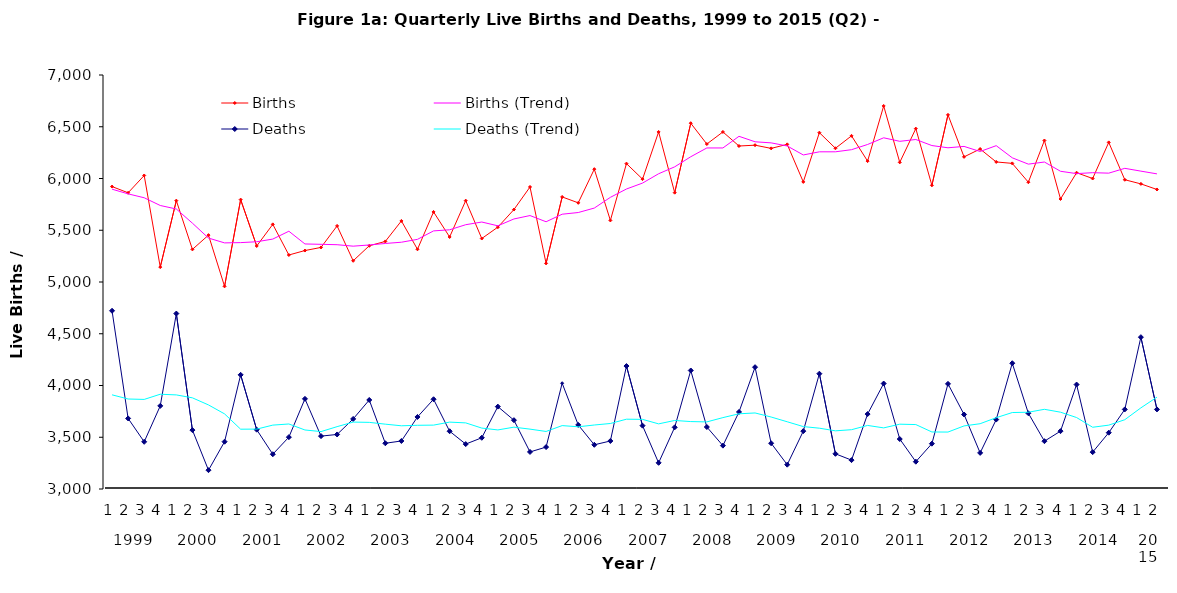
| Category | Births | Births (Trend) | Deaths | Deaths (Trend) |
|---|---|---|---|---|
| 0 | 5922 | 5896.75 | 4722 | 3910 |
| 1 | 5862 | 5851.5 | 3682 | 3869.5 |
| 2 | 6029 | 5814 | 3456 | 3865.5 |
| 3 | 5144 | 5739.25 | 3803 | 3915.75 |
| 4 | 5786 | 5705.25 | 4695 | 3909 |
| 5 | 5315 | 5568.5 | 3569 | 3880.75 |
| 6 | 5453 | 5424.5 | 3182 | 3812.25 |
| 7 | 4958 | 5378 | 3457 | 3725.75 |
| 8 | 5796 | 5380.5 | 4103 | 3577.75 |
| 9 | 5348 | 5388.75 | 3573 | 3578.75 |
| 10 | 5557 | 5414.75 | 3336 | 3617.25 |
| 11 | 5261 | 5490.5 | 3501 | 3628.25 |
| 12 | 5304 | 5367.5 | 3871 | 3570.25 |
| 13 | 5334 | 5364 | 3511 | 3554.75 |
| 14 | 5542 | 5360.25 | 3527 | 3602.5 |
| 15 | 5205 | 5346.25 | 3677 | 3646.5 |
| 16 | 5350 | 5357.75 | 3860 | 3643.75 |
| 17 | 5392 | 5372.25 | 3442 | 3626.5 |
| 18 | 5590 | 5384.25 | 3464 | 3610.75 |
| 19 | 5316 | 5412 | 3696 | 3615.5 |
| 20 | 5677 | 5493.75 | 3867 | 3617.25 |
| 21 | 5435 | 5504.5 | 3558 | 3646.25 |
| 22 | 5786 | 5553.5 | 3434 | 3638.75 |
| 23 | 5420 | 5579.5 | 3495 | 3588.5 |
| 24 | 5530 | 5542.75 | 3796 | 3570.75 |
| 25 | 5700 | 5609 | 3665 | 3597.5 |
| 26 | 5918 | 5642 | 3358 | 3578.5 |
| 27 | 5180 | 5582 | 3405 | 3556 |
| 28 | 5822 | 5655 | 4022 | 3612.5 |
| 29 | 5765 | 5671.25 | 3619 | 3601 |
| 30 | 6090 | 5714.25 | 3427 | 3618.25 |
| 31 | 5595 | 5818 | 3464 | 3633 |
| 32 | 6144 | 5898.5 | 4188 | 3674.5 |
| 33 | 5994 | 5955.75 | 3612 | 3672.75 |
| 34 | 6450 | 6045.75 | 3253 | 3629.25 |
| 35 | 5863 | 6112.75 | 3596 | 3662.25 |
| 36 | 6534 | 6210.25 | 4145 | 3651.5 |
| 37 | 6333 | 6295 | 3599 | 3648.25 |
| 38 | 6450 | 6295 | 3419 | 3689.75 |
| 39 | 6314 | 6407.75 | 3744 | 3726.75 |
| 40 | 6322 | 6354.75 | 4177 | 3734.75 |
| 41 | 6291 | 6344.25 | 3442 | 3695.5 |
| 42 | 6330 | 6314.25 | 3235 | 3649.5 |
| 43 | 5967 | 6227.5 | 3559 | 3603.25 |
| 44 | 6443 | 6257.75 | 4114 | 3587.5 |
| 45 | 6292 | 6258 | 3340 | 3562 |
| 46 | 6412 | 6278.5 | 3279 | 3573 |
| 47 | 6168 | 6328.75 | 3724 | 3614.25 |
| 48 | 6701 | 6393.25 | 4019 | 3590.5 |
| 49 | 6156 | 6359.25 | 3483 | 3626.25 |
| 50 | 6482 | 6376.75 | 3264 | 3622.5 |
| 51 | 5934 | 6318.25 | 3438 | 3551 |
| 52 | 6615 | 6296.75 | 4016 | 3550.25 |
| 53 | 6209 | 6310 | 3720 | 3609.5 |
| 54 | 6285 | 6260.75 | 3349 | 3630.75 |
| 55 | 6160 | 6317.25 | 3671 | 3689 |
| 56 | 6146 | 6200 | 4215 | 3738.75 |
| 57 | 5964 | 6138.75 | 3732 | 3741.75 |
| 58 | 6367 | 6159.25 | 3462 | 3770 |
| 59 | 5802 | 6069.75 | 3559 | 3742 |
| 60 | 6056 | 6047.25 | 4009 | 3690.5 |
| 61 | 6000 | 6056.25 | 3356 | 3596.5 |
| 62 | 6349 | 6051.75 | 3544 | 3617 |
| 63 | 5988 | 6098.25 | 3769 | 3669.5 |
| 64 | 5948 | 6071.25 | 4467 | 3784 |
| 65 | 5894 | 6044.75 | 3769 | 3887.25 |